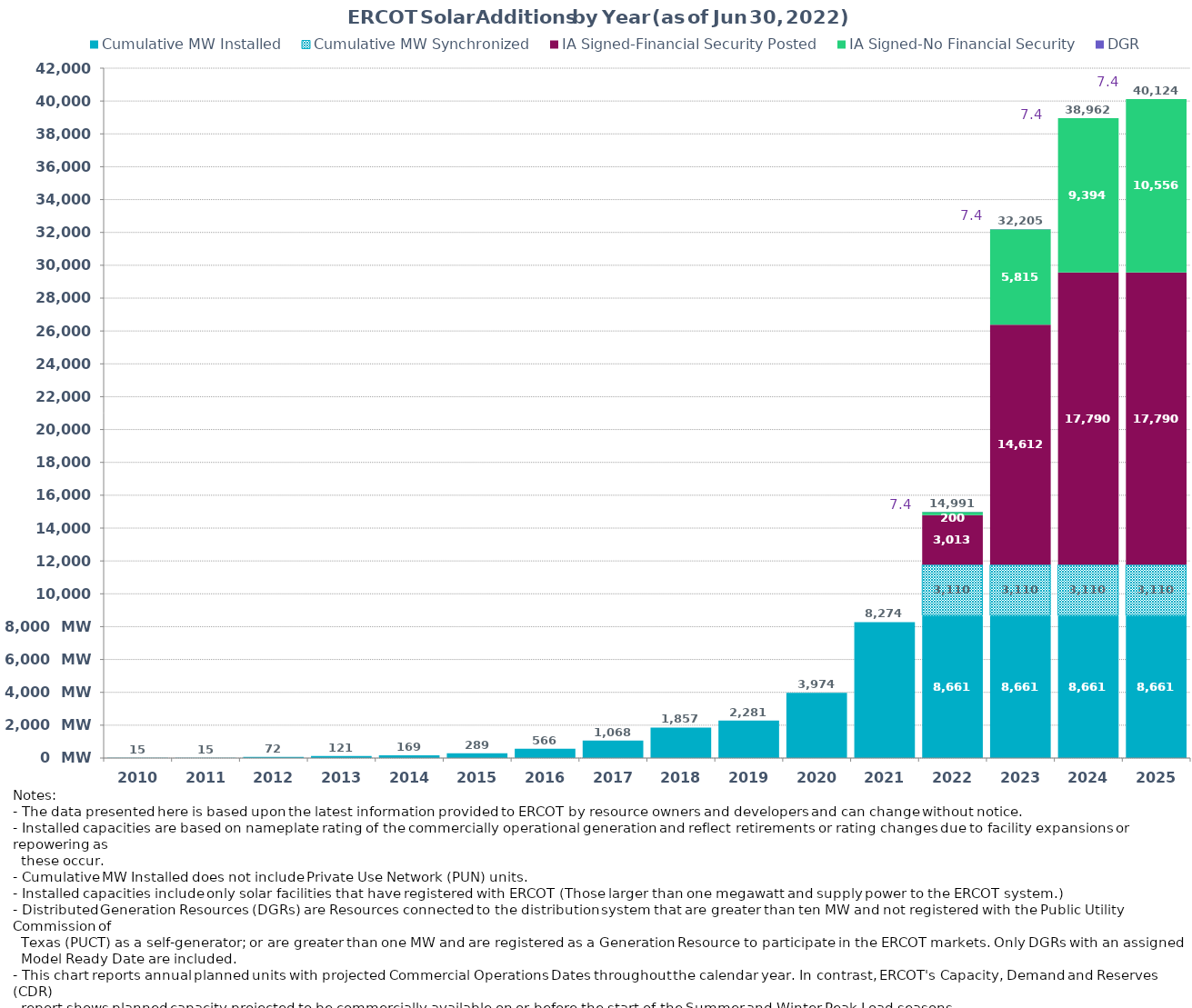
| Category | Cumulative MW Installed | Cumulative MW Synchronized | IA Signed-Financial Security Posted  | IA Signed-No Financial Security  | DGR | Cumulative Installed and Planned |
|---|---|---|---|---|---|---|
| 2010.0 | 15 | 0 | 0 | 0 | 0 | 15 |
| 2011.0 | 15 | 0 | 0 | 0 | 0 | 15 |
| 2012.0 | 72.3 | 0 | 0 | 0 | 0 | 72.3 |
| 2013.0 | 121.2 | 0 | 0 | 0 | 0 | 121.2 |
| 2014.0 | 168.7 | 0 | 0 | 0 | 0 | 168.7 |
| 2015.0 | 289.28 | 0 | 0 | 0 | 0 | 289.28 |
| 2016.0 | 565.78 | 0 | 0 | 0 | 0 | 565.78 |
| 2017.0 | 1067.78 | 0 | 0 | 0 | 0 | 1067.78 |
| 2018.0 | 1856.78 | 0 | 0 | 0 | 0 | 1856.78 |
| 2019.0 | 2281.38 | 0 | 0 | 0 | 0 | 2281.38 |
| 2020.0 | 3973.5 | 0 | 0 | 0 | 0 | 3973.5 |
| 2021.0 | 8273.55 | 0 | 0 | 0 | 0 | 8273.55 |
| 2022.0 | 8660.95 | 3109.68 | 3012.6 | 200 | 7.4 | 14990.63 |
| 2023.0 | 8660.95 | 3109.68 | 14611.6 | 5815.14 | 7.4 | 32204.77 |
| 2024.0 | 8660.95 | 3109.68 | 17790.1 | 9393.91 | 7.4 | 38962.04 |
| 2025.0 | 8660.95 | 3109.68 | 17790.1 | 10556.31 | 7.4 | 40124.44 |